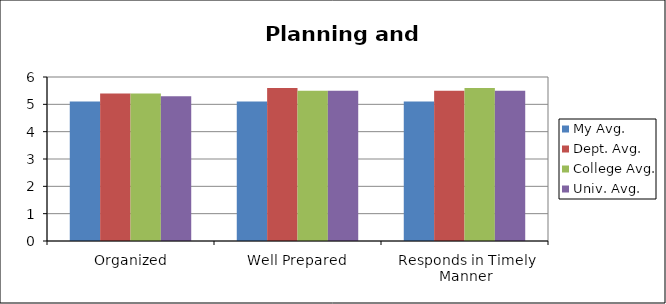
| Category | My Avg. | Dept. Avg. | College Avg. | Univ. Avg. |
|---|---|---|---|---|
| Organized | 5.1 | 5.4 | 5.4 | 5.3 |
| Well Prepared | 5.1 | 5.6 | 5.5 | 5.5 |
| Responds in Timely Manner | 5.1 | 5.5 | 5.6 | 5.5 |